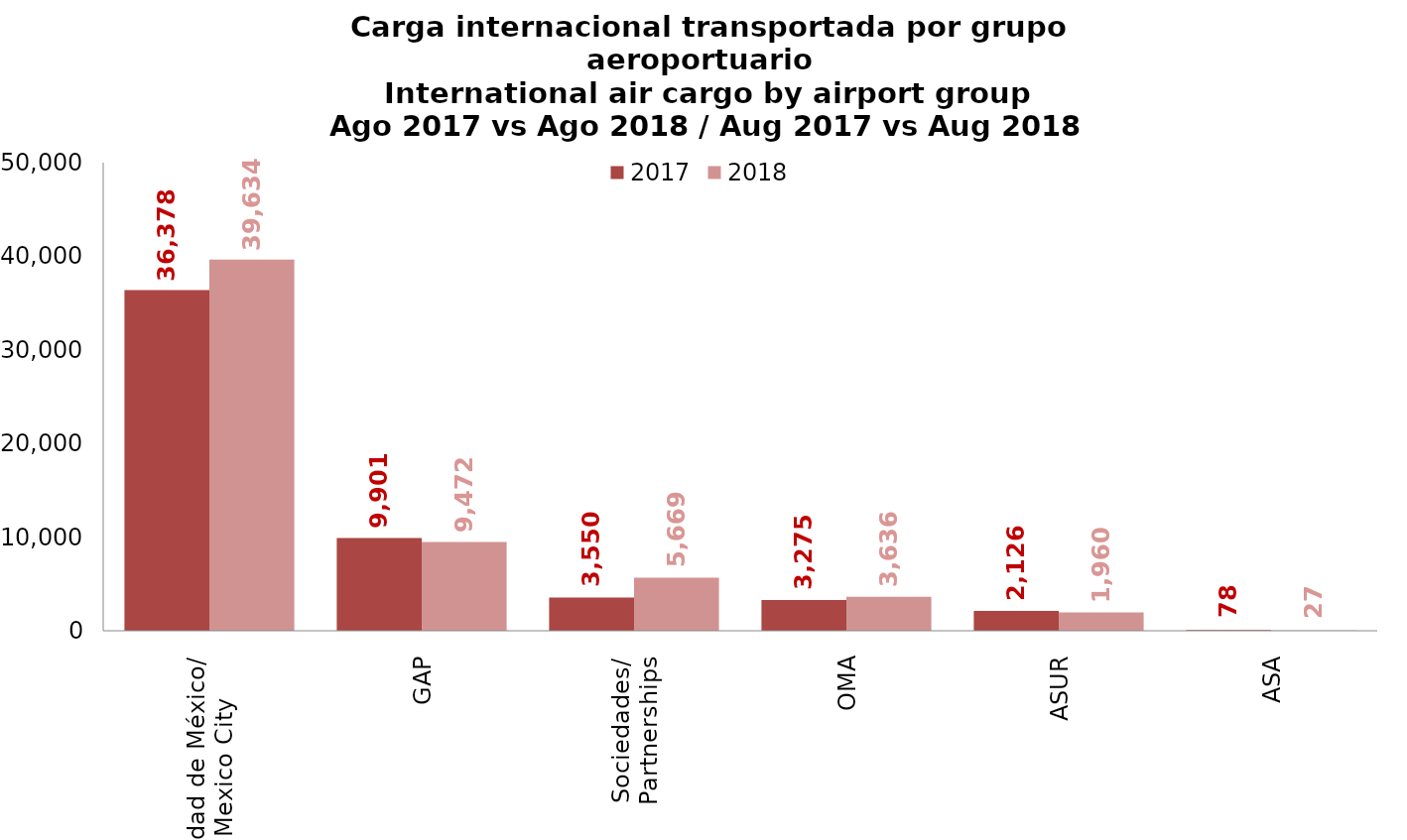
| Category | 2017 | 2018 |
|---|---|---|
| Ciudad de México/
Mexico City | 36377.96 | 39634.35 |
| GAP | 9901.339 | 9472.196 |
| Sociedades/
Partnerships | 3550.27 | 5668.828 |
| OMA | 3274.528 | 3636.449 |
| ASUR | 2126.069 | 1959.607 |
| ASA | 77.6 | 26.6 |